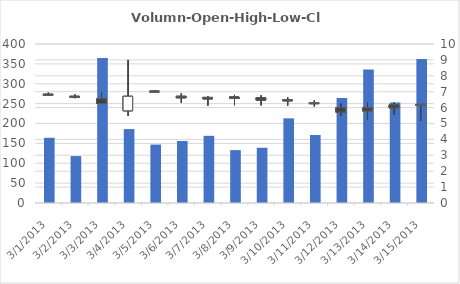
| Category | Volumn |
|---|---|
| 3/1/13 | 164 |
| 3/2/13 | 118 |
| 3/3/13 | 365 |
| 3/4/13 | 186 |
| 3/5/13 | 147 |
| 3/6/13 | 156 |
| 3/7/13 | 169 |
| 3/8/13 | 133 |
| 3/9/13 | 139 |
| 3/10/13 | 213 |
| 3/11/13 | 171 |
| 3/12/13 | 264 |
| 3/13/13 | 336 |
| 3/14/13 | 253 |
| 3/15/13 | 362 |